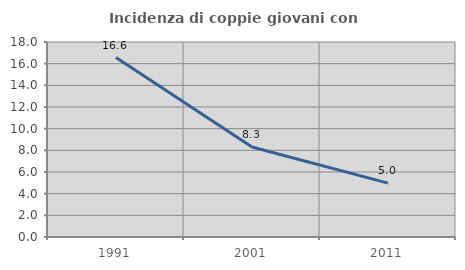
| Category | Incidenza di coppie giovani con figli |
|---|---|
| 1991.0 | 16.564 |
| 2001.0 | 8.308 |
| 2011.0 | 4.971 |